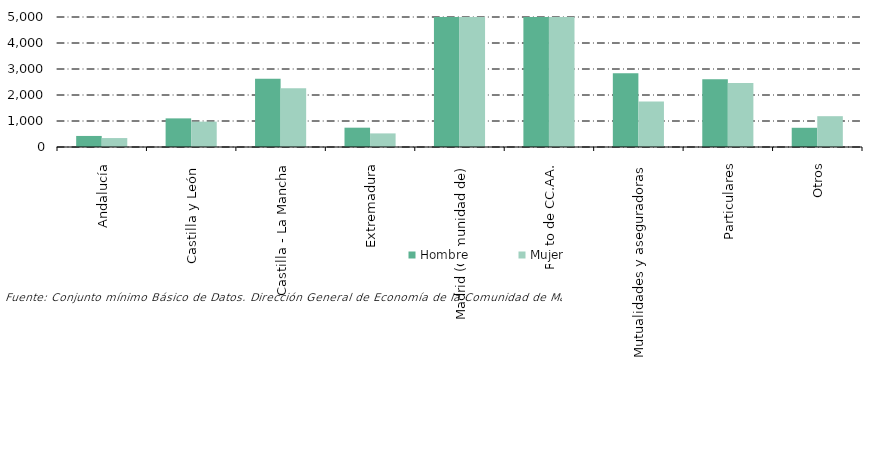
| Category | Hombre | Mujer |
|---|---|---|
| Andalucía | 425 | 344 |
| Castilla y León  | 1101 | 975 |
| Castilla - La Mancha | 2625 | 2262 |
| Extremadura | 743 | 523 |
| Madrid (Comunidad de) | 162460 | 183095 |
| Resto de CC.AA. | 78196 | 88897 |
| Mutualidades y aseguradoras | 2833 | 1748 |
| Particulares | 2605 | 2459 |
| Otros | 739 | 1185 |